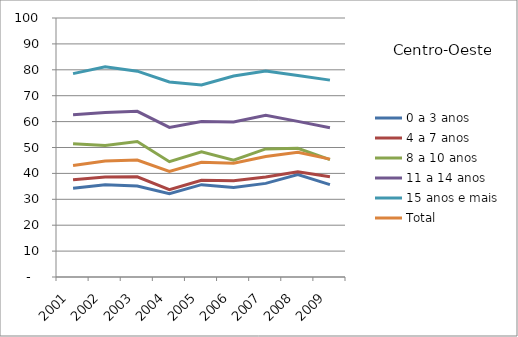
| Category | 0 a 3 anos | 4 a 7 anos | 8 a 10 anos | 11 a 14 anos | 15 anos e mais | Total |
|---|---|---|---|---|---|---|
| 2001.0 | 34.25 | 37.55 | 51.47 | 62.61 | 78.53 | 43.06 |
| 2002.0 | 35.59 | 38.63 | 50.79 | 63.53 | 81.18 | 44.75 |
| 2003.0 | 35.13 | 38.68 | 52.29 | 63.95 | 79.46 | 45.13 |
| 2004.0 | 32.13 | 33.74 | 44.51 | 57.74 | 75.32 | 40.74 |
| 2005.0 | 35.65 | 37.36 | 48.36 | 60 | 74.18 | 44.29 |
| 2006.0 | 34.59 | 37.15 | 45.1 | 59.84 | 77.61 | 43.96 |
| 2007.0 | 36.14 | 38.59 | 49.46 | 62.4 | 79.54 | 46.55 |
| 2008.0 | 39.59 | 40.59 | 49.68 | 60.09 | 77.77 | 48.19 |
| 2009.0 | 35.66 | 38.7 | 45.34 | 57.6 | 76.01 | 45.5 |